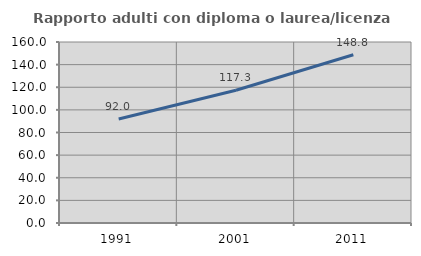
| Category | Rapporto adulti con diploma o laurea/licenza media  |
|---|---|
| 1991.0 | 91.97 |
| 2001.0 | 117.317 |
| 2011.0 | 148.77 |